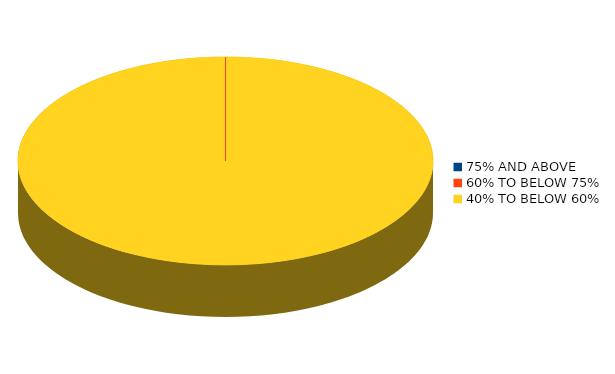
| Category | Number of students |
|---|---|
| 75% AND ABOVE | 0 |
| 60% TO BELOW 75% | 0 |
| 40% TO BELOW 60% | 1 |